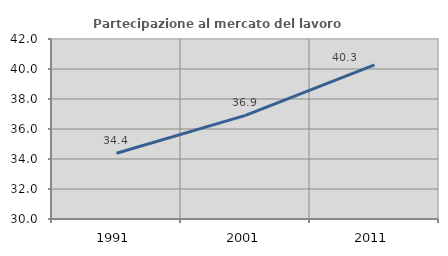
| Category | Partecipazione al mercato del lavoro  femminile |
|---|---|
| 1991.0 | 34.385 |
| 2001.0 | 36.908 |
| 2011.0 | 40.281 |